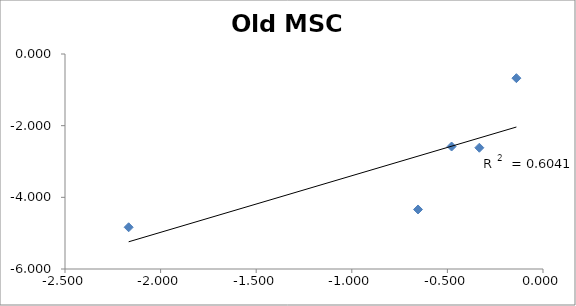
| Category | Old MSC  |
|---|---|
| -0.333 | -2.616 |
| -0.6536666666666667 | -4.339 |
| -0.13912333333333332 | -0.675 |
| -0.47810900666666667 | -2.582 |
| -2.1670089999999997 | -4.836 |